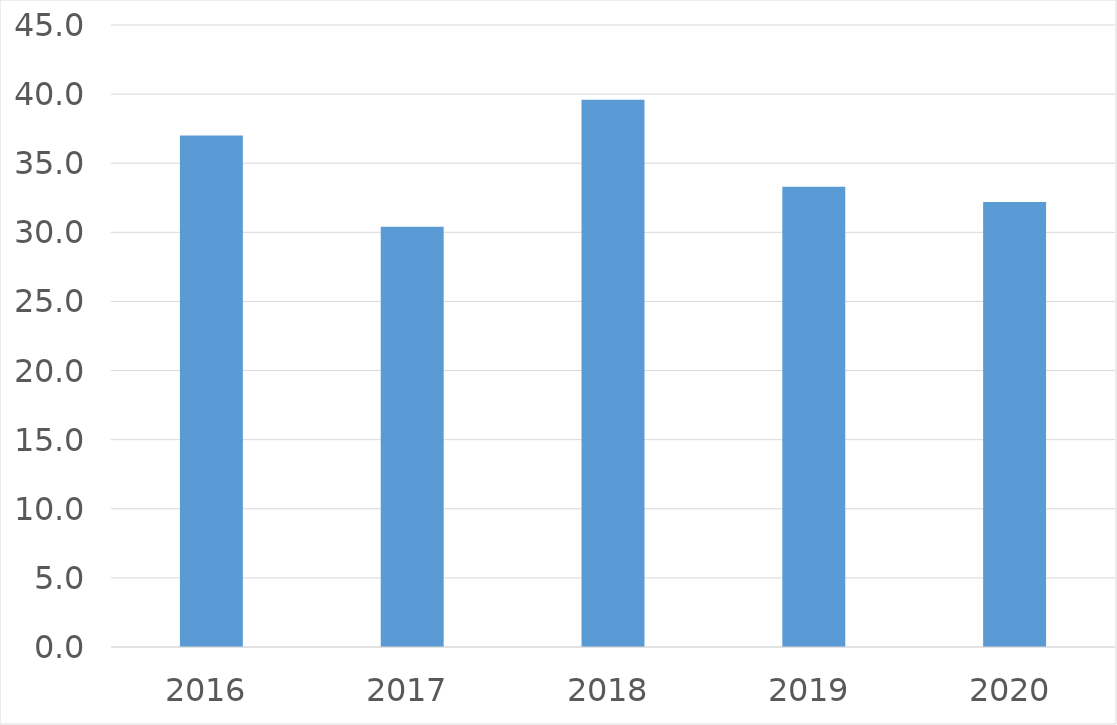
| Category | Series 0 |
|---|---|
| 2016 | 37 |
| 2017 | 30.4 |
| 2018 | 39.6 |
| 2019 | 33.3 |
| 2020 | 32.2 |